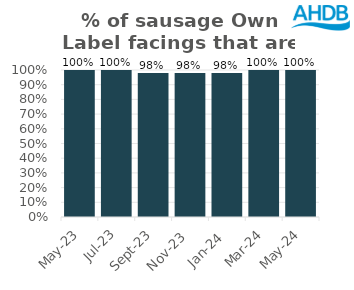
| Category | Sausage |
|---|---|
| 2023-05-01 | 1 |
| 2023-07-01 | 1 |
| 2023-09-01 | 0.98 |
| 2023-11-01 | 0.98 |
| 2024-01-01 | 0.98 |
| 2024-03-01 | 1 |
| 2024-05-01 | 1 |